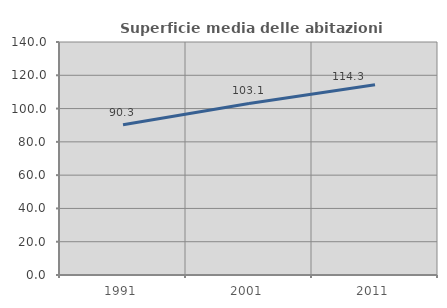
| Category | Superficie media delle abitazioni occupate |
|---|---|
| 1991.0 | 90.325 |
| 2001.0 | 103.109 |
| 2011.0 | 114.346 |